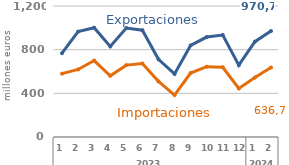
| Category | EXPORTACIONES | IMPORTACIONES |
|---|---|---|
| 0 | 767.51 | 580.55 |
| 1 | 965.45 | 618.85 |
| 2 | 1000.93 | 700.22 |
| 3 | 829.7 | 560.86 |
| 4 | 997.57 | 658.38 |
| 5 | 977.78 | 673.17 |
| 6 | 712.04 | 509.84 |
| 7 | 577.51 | 384.39 |
| 8 | 838.89 | 586.07 |
| 9 | 915.39 | 643.84 |
| 10 | 934.04 | 639.04 |
| 11 | 657.82 | 444.2 |
| 12 | 872.93 | 545.19 |
| 13 | 970.67 | 636.65 |